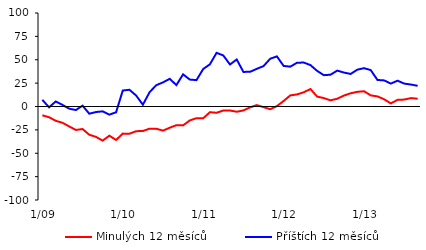
| Category | Minulých 12 měsíců | Příštích 12 měsíců |
|---|---|---|
|  1/09 | -9.4 | 7.1 |
|  2/09 | -11.5 | -0.9 |
|  3/09 | -15.3 | 5.4 |
|  4/09 | -17.4 | 1.7 |
|  5/09 | -21.3 | -2.3 |
|  6/09 | -25.1 | -3.8 |
|  7/09 | -24.1 | 0.9 |
|  8/09 | -30.2 | -7.7 |
|  9/09 | -32.5 | -5.9 |
|  10/09 | -36.5 | -5.2 |
|  11/09 | -31.2 | -8.7 |
|  12/09 | -35.8 | -6.2 |
|  1/10 | -29 | 17.1 |
|  2/10 | -29.1 | 17.9 |
|  3/10 | -26.4 | 11.7 |
|  4/10 | -26.2 | 1.9 |
|  5/10 | -23.7 | 15.3 |
|  6/10 | -23.8 | 22.8 |
|  7/10 | -25.8 | 25.8 |
|  8/10 | -22.7 | 29.6 |
|  9/10 | -20 | 22.9 |
|  10/10 | -20.2 | 34.4 |
|  11/10 | -14.9 | 28.8 |
|  12/10 | -12.5 | 28.2 |
|  1/11 | -12.6 | 40.1 |
|  2/11 | -6.1 | 45.1 |
|  3/11 | -6.7 | 57.4 |
|  4/11 | -4.3 | 54.6 |
|  5/11 | -4.3 | 44.9 |
|  6/11 | -5.6 | 50.3 |
|  7/11 | -4.2 | 37 |
|  8/11 | -0.9 | 37.1 |
|  9/11 | 1.5 | 40.3 |
|  10/11 | -0.7 | 43.2 |
|  11/11 | -2.9 | 51.1 |
|  12/11 | 0.4 | 53.6 |
|  1/12 | 5.9 | 43.4 |
|  2/12 | 11.9 | 42.6 |
|  3/12 | 12.9 | 46.8 |
|  4/12 | 15.2 | 47 |
|  5/12 | 18.7 | 44.3 |
|  6/12 | 10.6 | 38.1 |
|  7/12 | 9 | 33.5 |
|  8/12 | 6.6 | 34 |
|  9/12 | 8.3 | 38.4 |
|  10/12 | 11.7 | 36.3 |
|  11/12 | 14.1 | 34.8 |
|  12/12 | 15.7 | 39.4 |
|  1/13 | 16.3 | 41 |
|  2/13 | 11.9 | 38.9 |
|  3/13 | 10.8 | 28.4 |
|  4/13 | 7.7 | 27.9 |
|  5/13 | 3.3 | 24.5 |
|  6/13 | 7.1 | 27.6 |
|  7/13 | 7.4 | 24.5 |
|  8/13 | 9 | 23.5 |
|  9/13 | 8.3 | 22.1 |